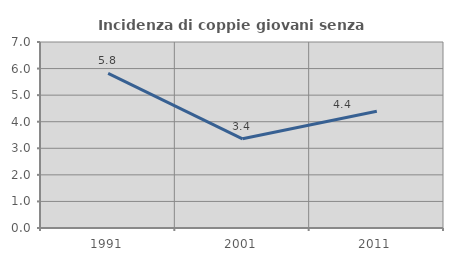
| Category | Incidenza di coppie giovani senza figli |
|---|---|
| 1991.0 | 5.822 |
| 2001.0 | 3.356 |
| 2011.0 | 4.392 |